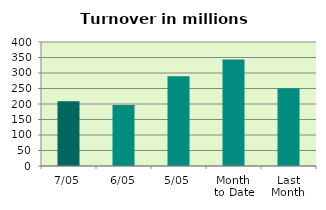
| Category | Series 0 |
|---|---|
| 7/05 | 208.735 |
| 6/05 | 196.535 |
| 5/05 | 289.347 |
| Month 
to Date | 343.151 |
| Last
Month | 250.745 |